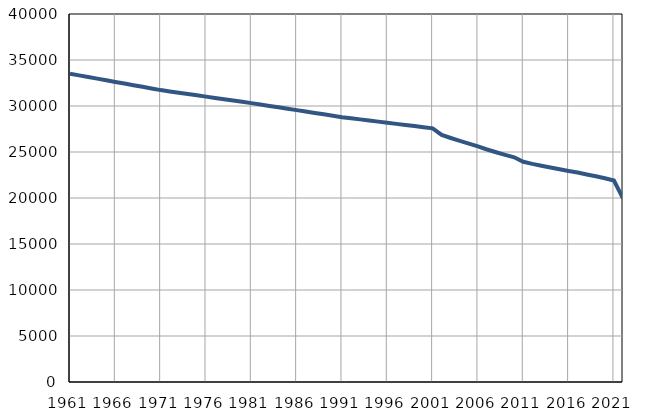
| Category | Број
становника |
|---|---|
| 1961.0 | 33507 |
| 1962.0 | 33329 |
| 1963.0 | 33151 |
| 1964.0 | 32974 |
| 1965.0 | 32796 |
| 1966.0 | 32618 |
| 1967.0 | 32440 |
| 1968.0 | 32262 |
| 1969.0 | 32085 |
| 1970.0 | 31907 |
| 1971.0 | 31729 |
| 1972.0 | 31587 |
| 1973.0 | 31446 |
| 1974.0 | 31304 |
| 1975.0 | 31162 |
| 1976.0 | 31020 |
| 1977.0 | 30879 |
| 1978.0 | 30737 |
| 1979.0 | 30595 |
| 1980.0 | 30454 |
| 1981.0 | 30312 |
| 1982.0 | 30160 |
| 1983.0 | 30007 |
| 1984.0 | 29855 |
| 1985.0 | 29702 |
| 1986.0 | 29550 |
| 1987.0 | 29398 |
| 1988.0 | 29245 |
| 1989.0 | 29093 |
| 1990.0 | 28940 |
| 1991.0 | 28788 |
| 1992.0 | 28666 |
| 1993.0 | 28545 |
| 1994.0 | 28423 |
| 1995.0 | 28301 |
| 1996.0 | 28180 |
| 1997.0 | 28058 |
| 1998.0 | 27937 |
| 1999.0 | 27815 |
| 2000.0 | 27693 |
| 2001.0 | 27572 |
| 2002.0 | 26855 |
| 2003.0 | 26524 |
| 2004.0 | 26211 |
| 2005.0 | 25918 |
| 2006.0 | 25601 |
| 2007.0 | 25271 |
| 2008.0 | 24970 |
| 2009.0 | 24690 |
| 2010.0 | 24422 |
| 2011.0 | 23940 |
| 2012.0 | 23712 |
| 2013.0 | 23512 |
| 2014.0 | 23320 |
| 2015.0 | 23116 |
| 2016.0 | 22932 |
| 2017.0 | 22762 |
| 2018.0 | 22563 |
| 2019.0 | 22359 |
| 2020.0 | 22139 |
| 2021.0 | 21896 |
| 2022.0 | 19976 |